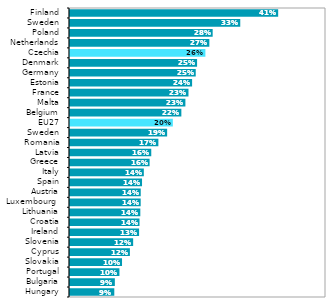
| Category | Series 1 |
|---|---|
| Hungary | 0.087 |
| Bulgaria | 0.088 |
| Portugal | 0.097 |
| Slovakia | 0.102 |
| Cyprus | 0.117 |
| Slovenia | 0.123 |
| Ireland | 0.135 |
| Croatia | 0.136 |
| Lithuania | 0.137 |
| Luxembourg  | 0.138 |
| Austria | 0.138 |
| Spain | 0.141 |
| Italy | 0.144 |
| Greece | 0.155 |
| Latvia | 0.159 |
| Romania | 0.173 |
| Sweden | 0.19 |
| EU27 | 0.201 |
| Belgium | 0.217 |
| Malta | 0.225 |
| France | 0.231 |
| Estonia | 0.238 |
| Germany | 0.246 |
| Denmark | 0.248 |
| Czechia | 0.264 |
| Netherlands | 0.272 |
| Poland | 0.279 |
| Sweden | 0.333 |
| Finland | 0.407 |